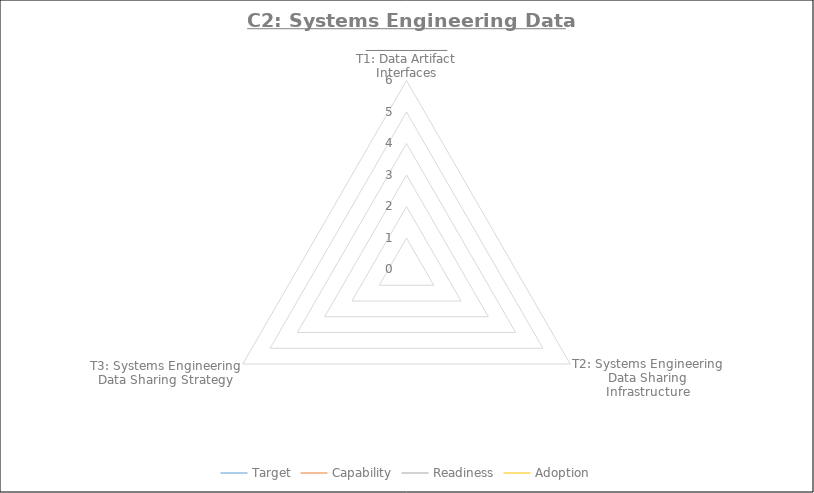
| Category | Target | Capability | Readiness | Adoption |
|---|---|---|---|---|
| T1: Data Artifact Interfaces | 0 | 0 | 0 | 0 |
| T2: Systems Engineering Data Sharing Infrastructure | 0 | 0 | 0 | 0 |
| T3: Systems Engineering Data Sharing Strategy | 0 | 0 | 0 | 0 |